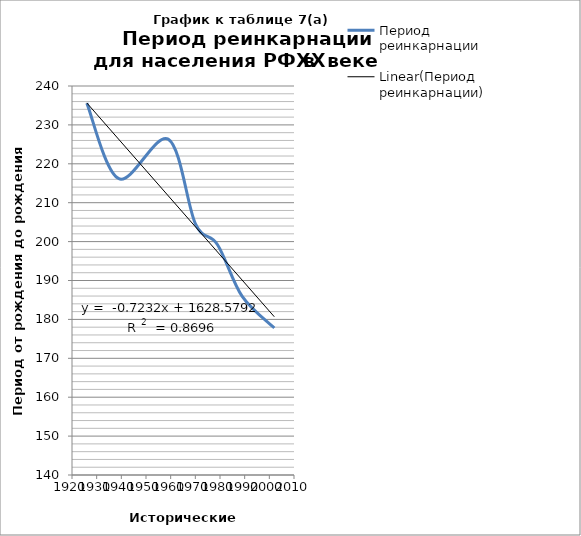
| Category | Период реинкарнации |
|---|---|
| 1926.0 | 235.589 |
| 1939.0 | 216.16 |
| 1959.0 | 226.35 |
| 1970.0 | 204.647 |
| 1979.0 | 199.187 |
| 1989.0 | 185.895 |
| 2002.0 | 177.797 |